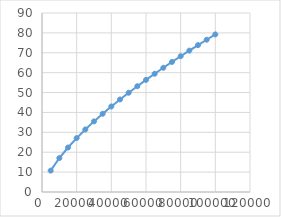
| Category | Series 0 |
|---|---|
| 5000.0 | 10.752 |
| 10000.0 | 17.068 |
| 15000.0 | 22.366 |
| 20000.0 | 27.095 |
| 25000.0 | 31.44 |
| 30000.0 | 35.504 |
| 35000.0 | 39.347 |
| 40000.0 | 43.01 |
| 45000.0 | 46.523 |
| 50000.0 | 49.909 |
| 55000.0 | 53.183 |
| 60000.0 | 56.359 |
| 65000.0 | 59.448 |
| 70000.0 | 62.459 |
| 75000.0 | 65.399 |
| 80000.0 | 68.274 |
| 85000.0 | 71.09 |
| 90000.0 | 73.851 |
| 95000.0 | 76.562 |
| 100000.0 | 79.225 |